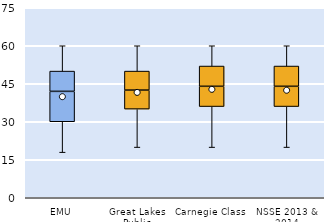
| Category | 25th | 50th | 75th |
|---|---|---|---|
| EMU | 30 | 12 | 8 |
| Great Lakes Public | 35 | 7.5 | 7.5 |
| Carnegie Class | 36 | 8 | 8 |
| NSSE 2013 & 2014 | 36 | 8 | 8 |